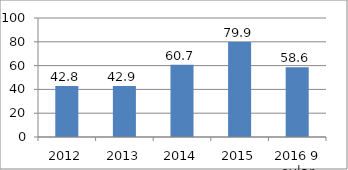
| Category | Series 0 |
|---|---|
| 2012 | 42.8 |
| 2013 | 42.9 |
| 2014 | 60.7 |
| 2015 | 79.9 |
| 2016 9 oylar | 58.6 |